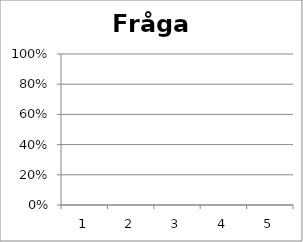
| Category | Fråga 8 |
|---|---|
| 0 | 0 |
| 1 | 0 |
| 2 | 0 |
| 3 | 0 |
| 4 | 0 |